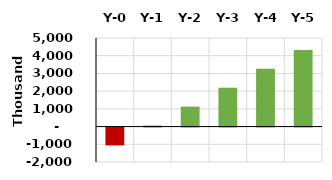
| Category | Series 0 |
|---|---|
| Y-0 | -1007040 |
| Y-1 | 59876.923 |
| Y-2 | 1126793.846 |
| Y-3 | 2193710.769 |
| Y-4 | 3260627.692 |
| Y-5 | 4327544.615 |